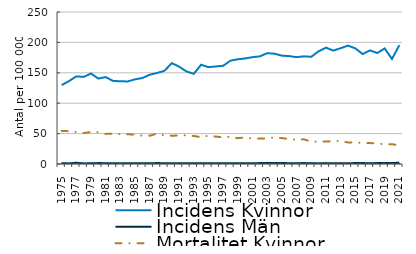
| Category | Incidens | Mortalitet |
|---|---|---|
| 1975.0 | 1.28 | 0.763 |
| 1976.0 | 0.979 | 0.271 |
| 1977.0 | 2.068 | 0.641 |
| 1978.0 | 0.974 | 0.618 |
| 1979.0 | 1.073 | 0.785 |
| 1980.0 | 1.575 | 1.234 |
| 1981.0 | 1.218 | 0.563 |
| 1982.0 | 1.119 | 0.239 |
| 1983.0 | 1.005 | 0.714 |
| 1984.0 | 1.261 | 0.312 |
| 1985.0 | 1.071 | 0.232 |
| 1986.0 | 1.385 | 0.409 |
| 1987.0 | 1.097 | 0.372 |
| 1988.0 | 1.533 | 0.283 |
| 1989.0 | 1.281 | 0.258 |
| 1990.0 | 1.013 | 0.438 |
| 1991.0 | 1.418 | 0.44 |
| 1992.0 | 1.069 | 0.445 |
| 1993.0 | 1.436 | 0.318 |
| 1994.0 | 1.191 | 0.463 |
| 1995.0 | 1.263 | 0.357 |
| 1996.0 | 1.429 | 0.519 |
| 1997.0 | 1.414 | 0.395 |
| 1998.0 | 1.119 | 0.392 |
| 1999.0 | 1.339 | 0.667 |
| 2000.0 | 1.239 | 0.108 |
| 2001.0 | 1.154 | 0.607 |
| 2002.0 | 1.499 | 0.287 |
| 2003.0 | 1.856 | 0.273 |
| 2004.0 | 1.423 | 0.375 |
| 2005.0 | 1.706 | 0.241 |
| 2006.0 | 1.27 | 0.304 |
| 2007.0 | 1.312 | 0.685 |
| 2008.0 | 1.516 | 0.389 |
| 2009.0 | 1.128 | 0.702 |
| 2010.0 | 1.005 | 0.226 |
| 2011.0 | 1.453 | 0.522 |
| 2012.0 | 1.293 | 0.337 |
| 2013.0 | 1.445 | 0.206 |
| 2014.0 | 1.205 | 0.176 |
| 2015.0 | 1.554 | 0.25 |
| 2016.0 | 1.602 | 0.388 |
| 2017.0 | 1.038 | 0.368 |
| 2018.0 | 1.68 | 0.259 |
| 2019.0 | 1.633 | 0.271 |
| 2020.0 | 1.566 | 0.289 |
| 2021.0 | 2.088 | 0.102 |